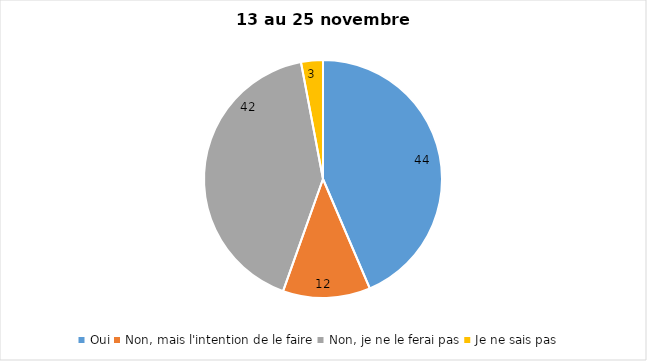
| Category | Series 0 |
|---|---|
| Oui | 44 |
| Non, mais l'intention de le faire | 12 |
| Non, je ne le ferai pas | 42 |
| Je ne sais pas | 3 |